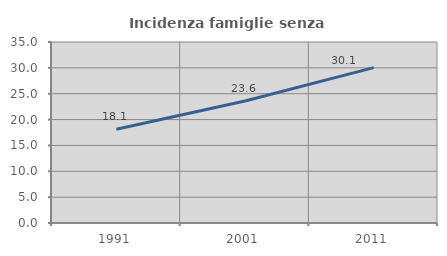
| Category | Incidenza famiglie senza nuclei |
|---|---|
| 1991.0 | 18.118 |
| 2001.0 | 23.591 |
| 2011.0 | 30.051 |